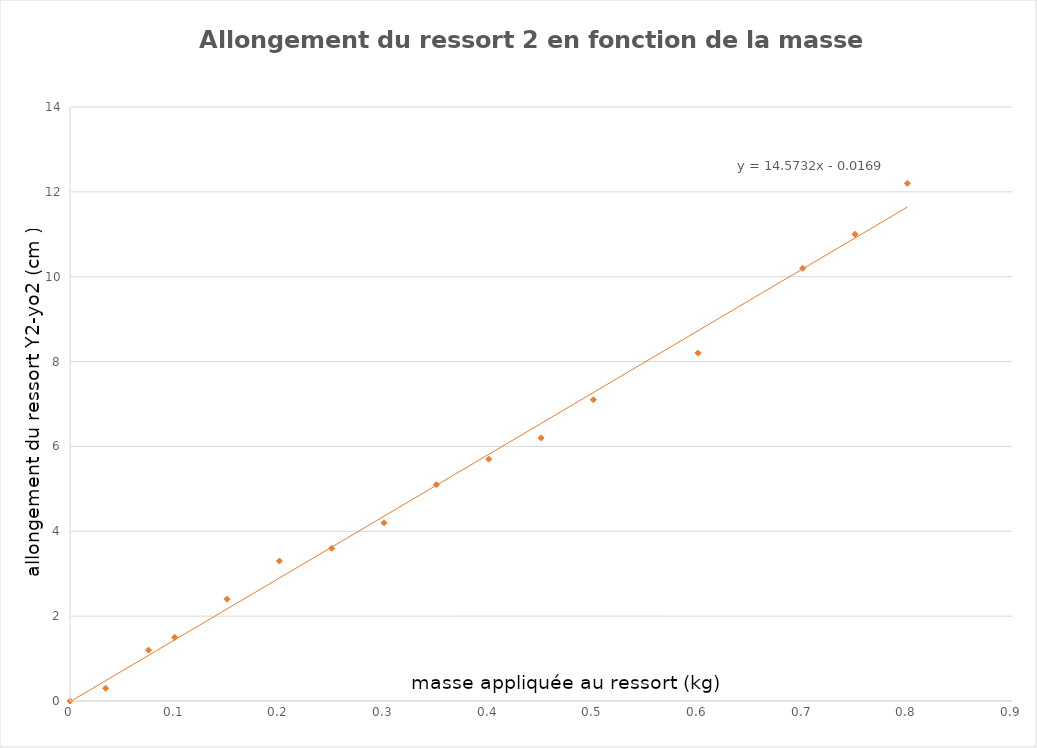
| Category | Series 0 |
|---|---|
| 0.034 | 0.3 |
| 0.075 | 1.2 |
| 0.1 | 1.5 |
| 0.15 | 2.4 |
| 0.2 | 3.3 |
| 0.25 | 3.6 |
| 0.3 | 4.2 |
| 0.35 | 5.1 |
| 0.4 | 5.7 |
| 0.45 | 6.2 |
| 0.5 | 7.1 |
| 0.6 | 8.2 |
| 0.7 | 10.2 |
| 0.75 | 11 |
| 0.8 | 12.2 |
| 0.0 | 0 |